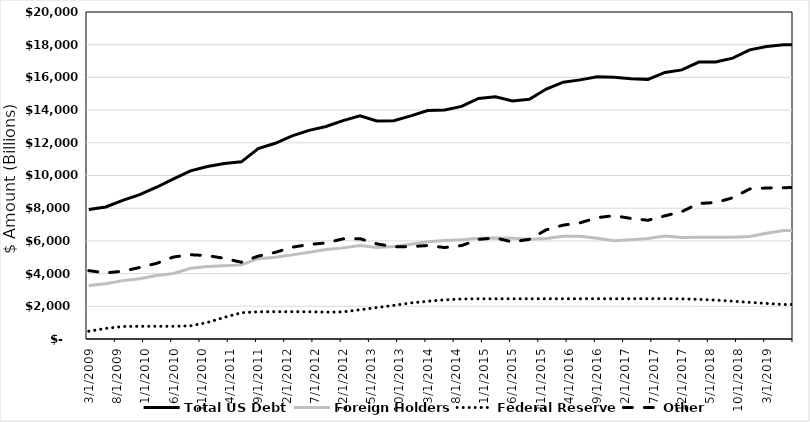
| Category | Total US Debt | Foreign Holders | Federal Reserve | Other |
|---|---|---|---|---|
| 3/31/09 | 7921.4 | 3265.7 | 474.731 | 4180.969 |
| 6/30/09 | 8075.5 | 3383.9 | 647.828 | 4043.772 |
| 9/30/09 | 8482.6 | 3570.6 | 766.128 | 4145.872 |
| 12/31/09 | 8835 | 3685.1 | 776.583 | 4373.317 |
| 3/31/10 | 9281.6 | 3877.9 | 776.691 | 4627.009 |
| 6/30/10 | 9796.6 | 4002.9 | 776.982 | 5016.718 |
| 9/30/10 | 10285.8 | 4324.2 | 808.932 | 5152.668 |
| 12/31/10 | 10547.5 | 4435.6 | 1010.285 | 5101.615 |
| 3/31/11 | 10738.4 | 4481.4 | 1323.233 | 4933.767 |
| 6/30/11 | 10834.3 | 4533.6 | 1607 | 4693.7 |
| 9/30/11 | 11645.6 | 4912.1 | 1663.6 | 5069.9 |
| 12/31/11 | 11971.8 | 5004.4 | 1671.444 | 5295.956 |
| 3/31/12 | 12429.1 | 5145.1 | 1667.941 | 5616.059 |
| 6/30/12 | 12758.1 | 5310.9 | 1666.768 | 5780.432 |
| 9/30/12 | 12996.3 | 5476.1 | 1643.158 | 5877.042 |
| 12/31/12 | 13355 | 5573.8 | 1656.666 | 6124.534 |
| 3/31/13 | 13649.9 | 5725 | 1788.388 | 6136.512 |
| 6/30/13 | 13336.3 | 5595 | 1923.266 | 5818.034 |
| 9/30/13 | 13348.6 | 5652.8 | 2056.784 | 5639.016 |
| 12/31/13 | 13646.2 | 5792.6 | 2204.93 | 5648.67 |
| 3/31/14 | 13974.9 | 5948.3 | 2308.978 | 5717.622 |
| 6/30/14 | 14007.2 | 6018.7 | 2394.367 | 5594.133 |
| 9/30/14 | 14229.7 | 6069.2 | 2447.066 | 5713.434 |
| 12/31/14 | 14713.3 | 6158 | 2461.388 | 6093.912 |
| 3/31/15 | 14811.5 | 6172.6 | 2459.71 | 6179.19 |
| 6/30/15 | 14558.8 | 6163.1 | 2460.891 | 5934.809 |
| 9/30/15 | 14665.8 | 6105.9 | 2461.947 | 6097.953 |
| 12/31/15 | 15287.1 | 6146.2 | 2461.558 | 6679.342 |
| 3/31/16 | 15710.1 | 6284.4 | 2461.31 | 6964.39 |
| 6/30/16 | 15849.3 | 6279.1 | 2462.253 | 7107.947 |
| 9/30/16 | 16042.5 | 6155.9 | 2463.477 | 7423.123 |
| 12/31/16 | 16009.5 | 6002.8 | 2463.591 | 7543.109 |
| 3/31/17 | 15910.9 | 6075.3 | 2464.276 | 7371.324 |
| 6/30/17 | 15879.4 | 6151.9 | 2465.014 | 7262.486 |
| 9/30/17 | 16301.2 | 6301.9 | 2465.434 | 7533.866 |
| 12/31/17 | 16457.5 | 6211.3 | 2454.224 | 7791.976 |
| 3/31/18 | 16938.4 | 6223.4 | 2424.824 | 8290.176 |
| 6/30/18 | 16948.8 | 6225 | 2378.203 | 8345.597 |
| 9/30/18 | 17177.7 | 6225.9 | 2313.207 | 8638.593 |
| 12/31/18 | 17684.7 | 6269.7 | 2240.698 | 9174.302 |
| 3/31/19 | 17887.5 | 6473.3 | 2175.575 | 9238.625 |
| 6/30/19 | 18002.7 | 6636.3 | 2110.193 | 9256.207 |
| 9/30/19 | 18002.7 | 6630.5 | 2107.405 | 9264.795 |